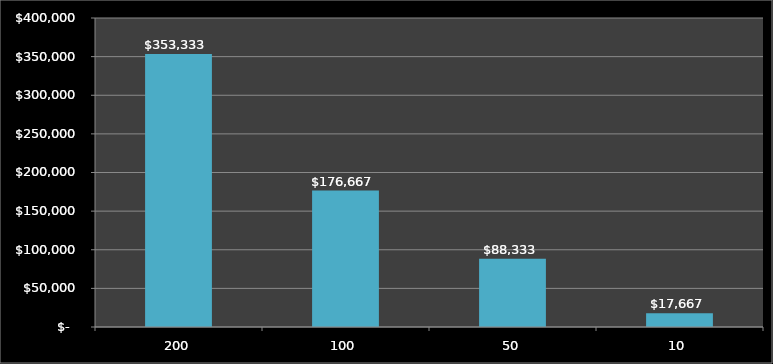
| Category | Series 0 |
|---|---|
| 200.0 | 353333.333 |
| 100.0 | 176666.667 |
| 50.0 | 88333.333 |
| 10.0 | 17666.667 |